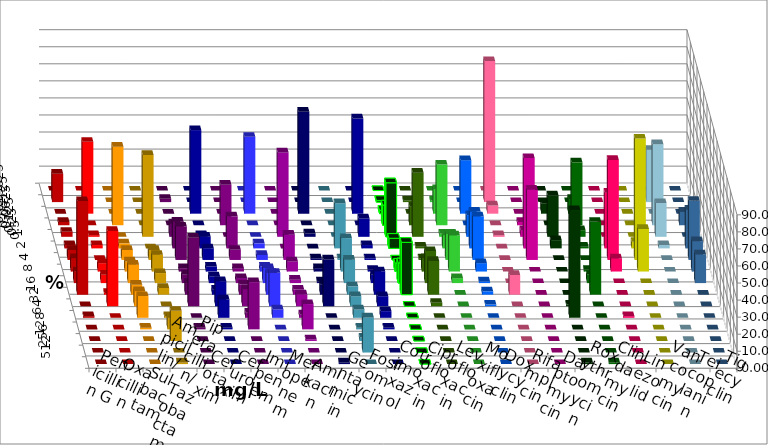
| Category | Penicillin G | Oxacillin | Ampicillin/ Sulbactam | Piperacillin/ Tazobactam | Cefotaxim | Cefuroxim | Imipenem | Meropenem | Amikacin | Gentamicin | Fosfomycin | Cotrimoxazol | Ciprofloxacin | Levofloxacin | Moxifloxacin | Doxycyclin | Rifampicin | Daptomycin | Roxythromycin | Clindamycin | Linezolid | Vancomycin | Teicoplanin | Tigecyclin |
|---|---|---|---|---|---|---|---|---|---|---|---|---|---|---|---|---|---|---|---|---|---|---|---|---|
| 0.015625 | 0 | 0 | 0 | 0 | 0 | 0 | 0 | 0 | 0 | 0 | 0 | 0 | 0 | 0 | 0 | 0 | 0 | 0 | 0 | 0 | 0 | 0 | 0 | 0 |
| 0.03125 | 16.667 | 0 | 0 | 0 | 1.961 | 0 | 0 | 0 | 0 | 0 | 0 | 0 | 0.99 | 0.99 | 0.962 | 0 | 82.692 | 0 | 0 | 0 | 0 | 0 | 0 | 30.693 |
| 0.0625 | 0 | 42.157 | 0 | 0 | 0 | 0 | 49.02 | 45.098 | 0 | 59.804 | 0 | 55.882 | 1.98 | 0 | 14.423 | 31.373 | 4.808 | 0 | 5.825 | 8.738 | 0 | 0 | 0 | 0 |
| 0.125 | 1.961 | 0 | 46.078 | 0 | 0 | 23.762 | 0 | 0 | 0 | 0 | 0 | 0 | 11.881 | 10.891 | 35.577 | 0 | 0 | 1.961 | 0 | 36.893 | 0 | 0 | 7.921 | 47.525 |
| 0.25 | 2.941 | 0.98 | 0 | 48.039 | 7.843 | 0 | 0.98 | 0 | 49.505 | 1.961 | 0 | 10.784 | 31.683 | 37.624 | 1.923 | 12.745 | 0.962 | 3.922 | 24.272 | 3.883 | 0 | 0 | 0 | 19.802 |
| 0.5 | 1.961 | 1.961 | 2.941 | 0 | 15.686 | 18.812 | 6.863 | 2.941 | 0 | 0 | 26.471 | 1.961 | 5.941 | 0.99 | 7.692 | 21.569 | 0 | 52.941 | 4.854 | 0.971 | 32.692 | 3.846 | 22.772 | 1.98 |
| 1.0 | 5.882 | 0 | 5.882 | 5.882 | 19.608 | 5.941 | 6.863 | 2.941 | 14.851 | 0.98 | 0.98 | 0.98 | 0 | 0.99 | 15.385 | 25.49 | 0 | 41.176 | 0 | 0 | 58.654 | 71.154 | 34.653 | 0 |
| 2.0 | 7.843 | 4.902 | 5.882 | 9.804 | 1.961 | 1.98 | 2.941 | 2.941 | 5.941 | 1.961 | 19.608 | 0.98 | 4.95 | 7.921 | 21.154 | 4.902 | 0 | 0 | 0 | 0.971 | 7.692 | 25 | 17.822 | 0 |
| 4.0 | 6.863 | 4.902 | 10.784 | 5.882 | 4.902 | 2.97 | 3.922 | 8.824 | 1.98 | 0.98 | 13.725 | 4.902 | 11.881 | 18.812 | 2.885 | 0.98 | 0 | 0 | 0 | 4.854 | 0 | 0 | 16.832 | 0 |
| 8.0 | 54.902 | 0.98 | 5.882 | 3.922 | 6.863 | 5.941 | 2.941 | 12.745 | 2.97 | 5.882 | 4.902 | 13.725 | 30.693 | 19.802 | 0 | 1.961 | 11.538 | 0 | 0 | 42.718 | 0 | 0 | 0 | 0 |
| 16.0 | 0 | 44.118 | 8.824 | 0 | 40.196 | 9.901 | 14.706 | 19.608 | 6.931 | 27.451 | 5.882 | 5.882 | 0 | 1.98 | 0 | 0.98 | 0 | 0 | 0.971 | 0 | 0 | 0 | 0 | 0 |
| 32.0 | 0.98 | 0 | 12.745 | 0.98 | 0 | 2.97 | 10.784 | 4.902 | 1.98 | 0 | 4.902 | 3.922 | 0 | 0 | 0 | 0 | 0 | 0 | 63.107 | 0 | 0.962 | 0 | 0 | 0 |
| 64.0 | 0 | 0 | 0.98 | 6.863 | 0.98 | 27.723 | 0.98 | 0 | 14.851 | 0 | 0.98 | 0.98 | 0 | 0 | 0 | 0 | 0 | 0 | 0 | 0 | 0 | 0 | 0 | 0 |
| 128.0 | 0 | 0 | 0 | 17.647 | 0 | 0 | 0 | 0 | 0.99 | 0 | 1.961 | 0 | 0 | 0 | 0 | 0 | 0 | 0 | 0 | 0 | 0 | 0 | 0 | 0 |
| 256.0 | 0 | 0 | 0 | 0 | 0 | 0 | 0 | 0 | 0 | 0 | 20.588 | 0 | 0 | 0 | 0 | 0 | 0 | 0 | 0 | 0 | 0 | 0 | 0 | 0 |
| 512.0 | 0 | 0 | 0 | 0.98 | 0 | 0 | 0 | 0 | 0 | 0.98 | 0 | 0 | 0 | 0 | 0 | 0 | 0 | 0 | 0.971 | 0.971 | 0 | 0 | 0 | 0 |